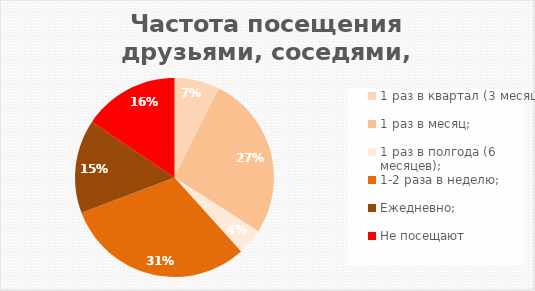
| Category | Итог |
|---|---|
| 1 раз в квартал (3 месяца); | 62 |
| 1 раз в месяц; | 227 |
| 1 раз в полгода (6 месяцев); | 36 |
| 1-2 раза в неделю; | 262 |
| Ежедневно; | 129 |
| Не посещают | 132 |